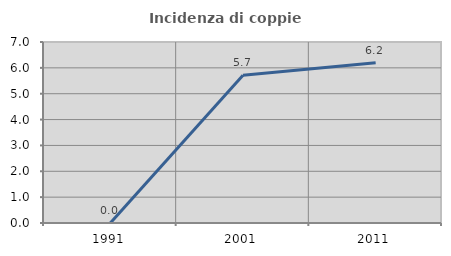
| Category | Incidenza di coppie miste |
|---|---|
| 1991.0 | 0 |
| 2001.0 | 5.714 |
| 2011.0 | 6.202 |